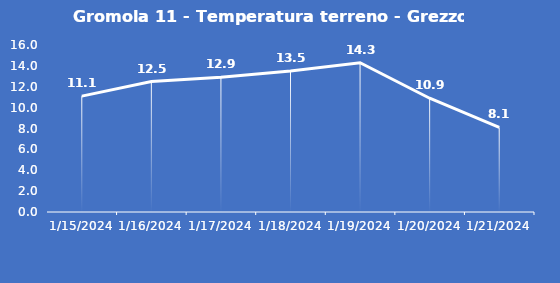
| Category | Gromola 11 - Temperatura terreno - Grezzo (°C) |
|---|---|
| 1/15/24 | 11.1 |
| 1/16/24 | 12.5 |
| 1/17/24 | 12.9 |
| 1/18/24 | 13.5 |
| 1/19/24 | 14.3 |
| 1/20/24 | 10.9 |
| 1/21/24 | 8.1 |